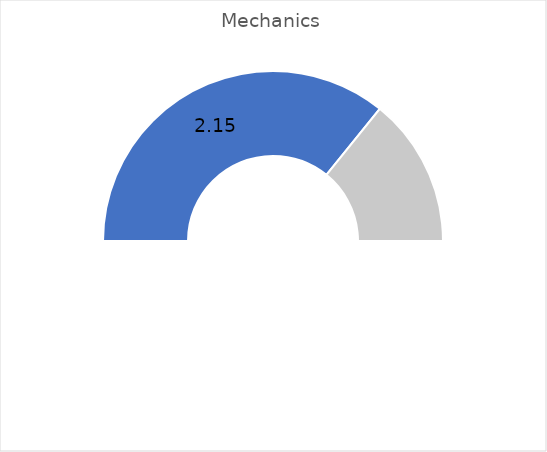
| Category | Series 0 |
|---|---|
| 0 | 0.716 |
| 1 | 0.284 |
| 2 | 1 |